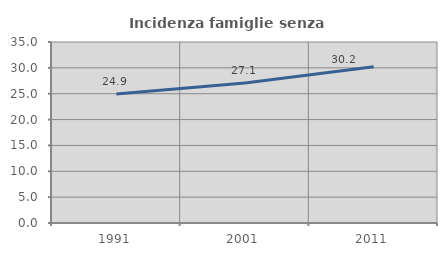
| Category | Incidenza famiglie senza nuclei |
|---|---|
| 1991.0 | 24.934 |
| 2001.0 | 27.083 |
| 2011.0 | 30.221 |